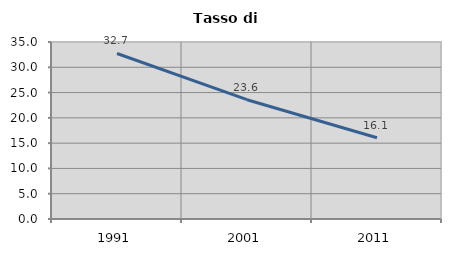
| Category | Tasso di disoccupazione   |
|---|---|
| 1991.0 | 32.727 |
| 2001.0 | 23.592 |
| 2011.0 | 16.062 |